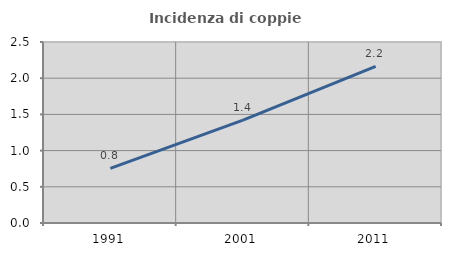
| Category | Incidenza di coppie miste |
|---|---|
| 1991.0 | 0.755 |
| 2001.0 | 1.422 |
| 2011.0 | 2.165 |